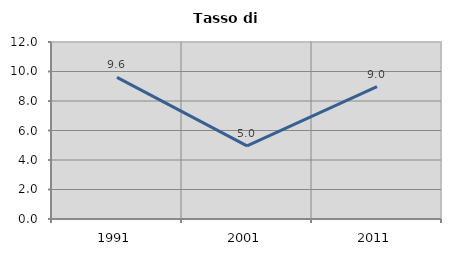
| Category | Tasso di disoccupazione   |
|---|---|
| 1991.0 | 9.601 |
| 2001.0 | 4.955 |
| 2011.0 | 8.975 |